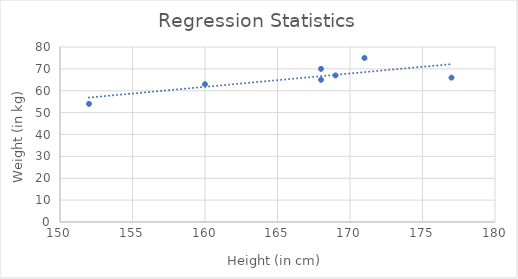
| Category | Weight (in kg) |
|---|---|
| 152.0 | 54 |
| 168.0 | 65 |
| 177.0 | 66 |
| 168.0 | 70 |
| 171.0 | 75 |
| 169.0 | 67 |
| 160.0 | 63 |